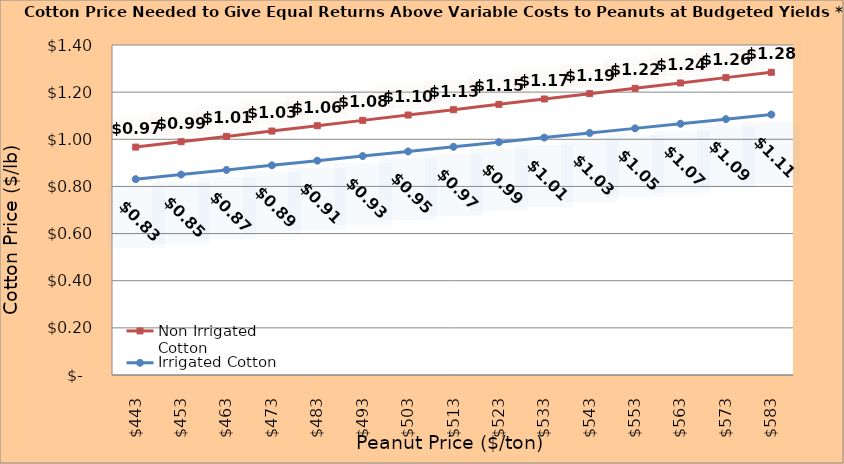
| Category | Non Irrigated Cotton | Irrigated Cotton |
|---|---|---|
| 442.5 | 0.967 | 0.831 |
| 452.5 | 0.99 | 0.85 |
| 462.5 | 1.012 | 0.87 |
| 472.5 | 1.035 | 0.89 |
| 482.5 | 1.058 | 0.909 |
| 492.5 | 1.08 | 0.929 |
| 502.5 | 1.103 | 0.948 |
| 512.5 | 1.126 | 0.968 |
| 522.5 | 1.148 | 0.988 |
| 532.5 | 1.171 | 1.007 |
| 542.5 | 1.194 | 1.027 |
| 552.5 | 1.216 | 1.046 |
| 562.5 | 1.239 | 1.066 |
| 572.5 | 1.262 | 1.085 |
| 582.5 | 1.284 | 1.105 |